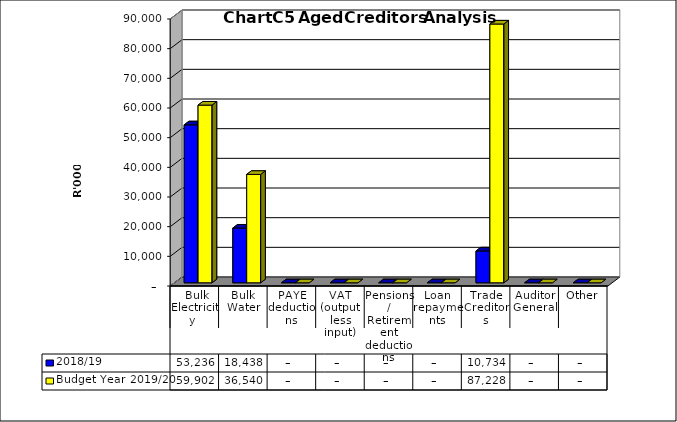
| Category | 2018/19 | Budget Year 2019/20 |
|---|---|---|
|  Bulk Electricity  | 53236049 | 59901730.02 |
| Bulk Water | 18438235 | 36539758.16 |
| PAYE deductions | 0 | 0 |
| VAT (output less input) | 0 | 0 |
| Pensions / Retirement deductions | 0 | 0 |
| Loan repayments | 0 | 0 |
| Trade Creditors | 10733951 | 87228450.18 |
| Auditor General | 0 | 0 |
| Other | 0 | 0 |